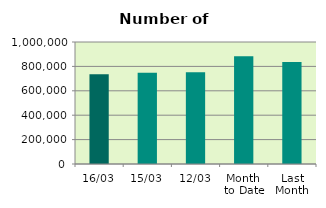
| Category | Series 0 |
|---|---|
| 16/03 | 735522 |
| 15/03 | 746928 |
| 12/03 | 752418 |
| Month 
to Date | 884198.833 |
| Last
Month | 836497.7 |